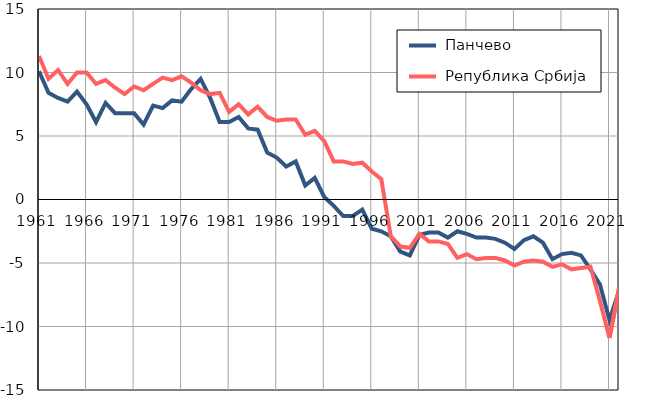
| Category |  Панчево |  Република Србија |
|---|---|---|
| 1961.0 | 10.1 | 11.3 |
| 1962.0 | 8.4 | 9.5 |
| 1963.0 | 8 | 10.2 |
| 1964.0 | 7.7 | 9.1 |
| 1965.0 | 8.5 | 10 |
| 1966.0 | 7.5 | 10 |
| 1967.0 | 6.1 | 9.1 |
| 1968.0 | 7.6 | 9.4 |
| 1969.0 | 6.8 | 8.8 |
| 1970.0 | 6.8 | 8.3 |
| 1971.0 | 6.8 | 8.9 |
| 1972.0 | 5.9 | 8.6 |
| 1973.0 | 7.4 | 9.1 |
| 1974.0 | 7.2 | 9.6 |
| 1975.0 | 7.8 | 9.4 |
| 1976.0 | 7.7 | 9.7 |
| 1977.0 | 8.7 | 9.2 |
| 1978.0 | 9.5 | 8.6 |
| 1979.0 | 8 | 8.3 |
| 1980.0 | 6.1 | 8.4 |
| 1981.0 | 6.1 | 6.9 |
| 1982.0 | 6.5 | 7.5 |
| 1983.0 | 5.6 | 6.7 |
| 1984.0 | 5.5 | 7.3 |
| 1985.0 | 3.7 | 6.5 |
| 1986.0 | 3.3 | 6.2 |
| 1987.0 | 2.6 | 6.3 |
| 1988.0 | 3 | 6.3 |
| 1989.0 | 1.1 | 5.1 |
| 1990.0 | 1.7 | 5.4 |
| 1991.0 | 0.2 | 4.6 |
| 1992.0 | -0.5 | 3 |
| 1993.0 | -1.3 | 3 |
| 1994.0 | -1.3 | 2.8 |
| 1995.0 | -0.8 | 2.9 |
| 1996.0 | -2.3 | 2.2 |
| 1997.0 | -2.5 | 1.6 |
| 1998.0 | -2.9 | -2.9 |
| 1999.0 | -4.1 | -3.7 |
| 2000.0 | -4.4 | -3.8 |
| 2001.0 | -2.8 | -2.7 |
| 2002.0 | -2.6 | -3.3 |
| 2003.0 | -2.6 | -3.3 |
| 2004.0 | -3 | -3.5 |
| 2005.0 | -2.5 | -4.6 |
| 2006.0 | -2.7 | -4.3 |
| 2007.0 | -3 | -4.7 |
| 2008.0 | -3 | -4.6 |
| 2009.0 | -3.1 | -4.6 |
| 2010.0 | -3.4 | -4.8 |
| 2011.0 | -3.9 | -5.2 |
| 2012.0 | -3.2 | -4.9 |
| 2013.0 | -2.9 | -4.8 |
| 2014.0 | -3.4 | -4.9 |
| 2015.0 | -4.7 | -5.3 |
| 2016.0 | -4.3 | -5.1 |
| 2017.0 | -4.2 | -5.5 |
| 2018.0 | -4.4 | -5.4 |
| 2019.0 | -5.5 | -5.3 |
| 2020.0 | -6.7 | -8 |
| 2021.0 | -9.5 | -10.9 |
| 2022.0 | -7.2 | -7 |